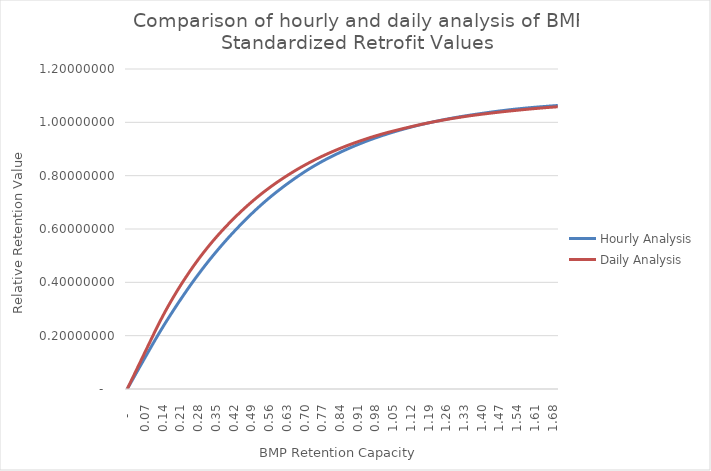
| Category | Hourly Analysis | Daily Analysis |
|---|---|---|
| 0.0 | 0 | 0 |
| 0.01 | 0.017 | 0.02 |
| 0.02 | 0.034 | 0.039 |
| 0.03 | 0.051 | 0.059 |
| 0.04 | 0.067 | 0.079 |
| 0.05 | 0.084 | 0.099 |
| 0.06 | 0.101 | 0.118 |
| 0.07 | 0.118 | 0.138 |
| 0.08 | 0.134 | 0.158 |
| 0.09 | 0.151 | 0.177 |
| 0.1 | 0.167 | 0.197 |
| 0.11 | 0.184 | 0.217 |
| 0.12 | 0.2 | 0.236 |
| 0.13 | 0.216 | 0.255 |
| 0.14 | 0.232 | 0.273 |
| 0.15 | 0.247 | 0.291 |
| 0.16 | 0.262 | 0.308 |
| 0.17 | 0.277 | 0.325 |
| 0.18 | 0.292 | 0.341 |
| 0.19 | 0.306 | 0.357 |
| 0.2 | 0.321 | 0.373 |
| 0.21 | 0.335 | 0.388 |
| 0.22 | 0.349 | 0.403 |
| 0.23 | 0.363 | 0.417 |
| 0.24 | 0.376 | 0.431 |
| 0.25 | 0.39 | 0.445 |
| 0.26 | 0.403 | 0.459 |
| 0.27 | 0.416 | 0.472 |
| 0.28 | 0.429 | 0.485 |
| 0.29 | 0.442 | 0.498 |
| 0.3 | 0.454 | 0.51 |
| 0.31 | 0.466 | 0.522 |
| 0.32 | 0.478 | 0.534 |
| 0.33 | 0.49 | 0.546 |
| 0.34 | 0.502 | 0.557 |
| 0.35 | 0.513 | 0.568 |
| 0.36 | 0.525 | 0.579 |
| 0.37 | 0.536 | 0.589 |
| 0.38 | 0.547 | 0.599 |
| 0.39 | 0.557 | 0.61 |
| 0.4 | 0.568 | 0.619 |
| 0.41 | 0.578 | 0.629 |
| 0.42 | 0.589 | 0.639 |
| 0.43 | 0.599 | 0.648 |
| 0.44 | 0.609 | 0.657 |
| 0.45 | 0.619 | 0.666 |
| 0.46 | 0.628 | 0.675 |
| 0.47 | 0.638 | 0.684 |
| 0.48 | 0.647 | 0.692 |
| 0.49 | 0.656 | 0.701 |
| 0.5 | 0.665 | 0.709 |
| 0.51 | 0.674 | 0.717 |
| 0.52 | 0.683 | 0.724 |
| 0.53 | 0.691 | 0.732 |
| 0.54 | 0.7 | 0.739 |
| 0.55 | 0.708 | 0.747 |
| 0.56 | 0.716 | 0.754 |
| 0.57 | 0.724 | 0.761 |
| 0.58 | 0.732 | 0.768 |
| 0.59 | 0.739 | 0.774 |
| 0.6 | 0.747 | 0.781 |
| 0.61 | 0.754 | 0.787 |
| 0.62 | 0.761 | 0.793 |
| 0.63 | 0.768 | 0.799 |
| 0.64 | 0.775 | 0.805 |
| 0.65 | 0.782 | 0.811 |
| 0.66 | 0.788 | 0.817 |
| 0.67 | 0.795 | 0.823 |
| 0.68 | 0.802 | 0.828 |
| 0.69 | 0.808 | 0.834 |
| 0.7 | 0.814 | 0.839 |
| 0.71 | 0.82 | 0.844 |
| 0.72 | 0.826 | 0.849 |
| 0.73 | 0.832 | 0.854 |
| 0.74 | 0.838 | 0.859 |
| 0.75 | 0.843 | 0.864 |
| 0.76 | 0.848 | 0.868 |
| 0.77 | 0.854 | 0.873 |
| 0.78 | 0.859 | 0.877 |
| 0.79 | 0.864 | 0.882 |
| 0.8 | 0.869 | 0.886 |
| 0.81 | 0.873 | 0.89 |
| 0.82 | 0.878 | 0.894 |
| 0.83 | 0.883 | 0.898 |
| 0.84 | 0.887 | 0.902 |
| 0.85 | 0.892 | 0.906 |
| 0.86 | 0.896 | 0.91 |
| 0.87 | 0.9 | 0.913 |
| 0.88 | 0.904 | 0.917 |
| 0.89 | 0.908 | 0.92 |
| 0.9 | 0.912 | 0.924 |
| 0.91 | 0.916 | 0.927 |
| 0.92 | 0.92 | 0.93 |
| 0.93 | 0.924 | 0.934 |
| 0.94 | 0.928 | 0.937 |
| 0.95 | 0.931 | 0.94 |
| 0.96 | 0.935 | 0.943 |
| 0.97 | 0.938 | 0.946 |
| 0.98 | 0.942 | 0.949 |
| 0.99 | 0.945 | 0.952 |
| 1.0 | 0.948 | 0.954 |
| 1.01 | 0.951 | 0.957 |
| 1.02 | 0.954 | 0.96 |
| 1.03 | 0.957 | 0.962 |
| 1.04 | 0.96 | 0.965 |
| 1.05 | 0.963 | 0.967 |
| 1.06 | 0.966 | 0.97 |
| 1.07 | 0.969 | 0.972 |
| 1.08 | 0.972 | 0.974 |
| 1.09 | 0.974 | 0.977 |
| 1.1 | 0.977 | 0.979 |
| 1.11 | 0.979 | 0.981 |
| 1.12 | 0.982 | 0.983 |
| 1.13 | 0.984 | 0.986 |
| 1.14 | 0.987 | 0.988 |
| 1.15 | 0.989 | 0.99 |
| 1.16 | 0.991 | 0.992 |
| 1.17 | 0.994 | 0.994 |
| 1.18 | 0.996 | 0.996 |
| 1.19 | 0.998 | 0.998 |
| 1.2 | 1 | 1 |
| 1.21 | 1.002 | 1.002 |
| 1.22 | 1.004 | 1.004 |
| 1.23 | 1.006 | 1.006 |
| 1.24 | 1.008 | 1.007 |
| 1.25 | 1.01 | 1.009 |
| 1.26 | 1.012 | 1.011 |
| 1.27 | 1.013 | 1.012 |
| 1.28 | 1.015 | 1.014 |
| 1.29 | 1.017 | 1.015 |
| 1.3 | 1.019 | 1.017 |
| 1.31 | 1.02 | 1.018 |
| 1.32 | 1.022 | 1.02 |
| 1.33 | 1.023 | 1.021 |
| 1.34 | 1.025 | 1.023 |
| 1.35 | 1.026 | 1.024 |
| 1.36 | 1.028 | 1.026 |
| 1.37 | 1.029 | 1.027 |
| 1.38 | 1.031 | 1.028 |
| 1.39 | 1.032 | 1.029 |
| 1.4 | 1.033 | 1.03 |
| 1.41 | 1.035 | 1.032 |
| 1.42 | 1.036 | 1.033 |
| 1.43 | 1.038 | 1.034 |
| 1.44 | 1.039 | 1.035 |
| 1.45 | 1.04 | 1.036 |
| 1.46 | 1.041 | 1.037 |
| 1.47 | 1.043 | 1.038 |
| 1.48 | 1.044 | 1.039 |
| 1.49 | 1.045 | 1.04 |
| 1.5 | 1.046 | 1.042 |
| 1.51 | 1.047 | 1.042 |
| 1.52 | 1.048 | 1.043 |
| 1.53 | 1.049 | 1.044 |
| 1.54 | 1.05 | 1.045 |
| 1.55 | 1.051 | 1.046 |
| 1.56 | 1.052 | 1.047 |
| 1.57 | 1.053 | 1.048 |
| 1.58 | 1.054 | 1.049 |
| 1.59 | 1.055 | 1.05 |
| 1.6 | 1.056 | 1.051 |
| 1.61 | 1.057 | 1.052 |
| 1.62 | 1.057 | 1.052 |
| 1.63 | 1.058 | 1.053 |
| 1.64 | 1.059 | 1.054 |
| 1.65 | 1.06 | 1.055 |
| 1.66 | 1.06 | 1.056 |
| 1.67 | 1.061 | 1.056 |
| 1.68 | 1.062 | 1.057 |
| 1.69 | 1.062 | 1.058 |
| 1.7 | 1.063 | 1.058 |